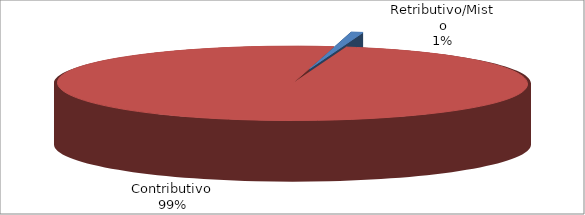
| Category | Decorrenti gennaio - settembre 2019 |
|---|---|
| Retributivo/Misto | 212 |
| Contributivo | 25676 |